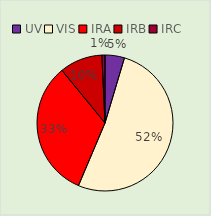
| Category | Series 0 |
|---|---|
| UV | 0.046 |
| VIS | 0.518 |
| IRA | 0.327 |
| IRB | 0.102 |
| IRC | 0.007 |